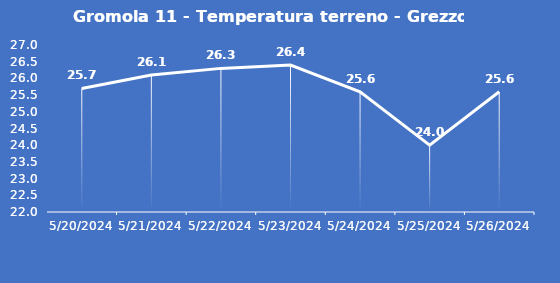
| Category | Gromola 11 - Temperatura terreno - Grezzo (°C) |
|---|---|
| 5/20/24 | 25.7 |
| 5/21/24 | 26.1 |
| 5/22/24 | 26.3 |
| 5/23/24 | 26.4 |
| 5/24/24 | 25.6 |
| 5/25/24 | 24 |
| 5/26/24 | 25.6 |